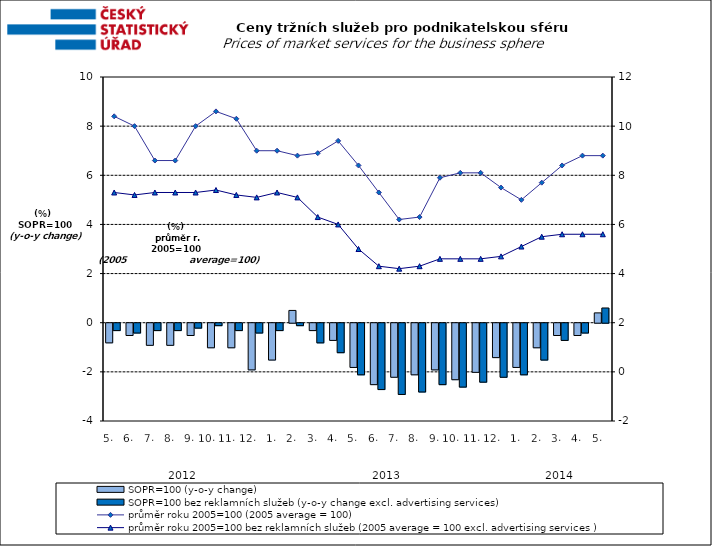
| Category | SOPR=100 (y-o-y change)   | SOPR=100 bez reklamních služeb (y-o-y change excl. advertising services)   |
|---|---|---|
| 0 | -0.8 | -0.3 |
| 1 | -0.5 | -0.4 |
| 2 | -0.9 | -0.3 |
| 3 | -0.9 | -0.3 |
| 4 | -0.5 | -0.2 |
| 5 | -1 | -0.1 |
| 6 | -1 | -0.3 |
| 7 | -1.9 | -0.4 |
| 8 | -1.5 | -0.3 |
| 9 | 0.5 | -0.1 |
| 10 | -0.3 | -0.8 |
| 11 | -0.7 | -1.2 |
| 12 | -1.8 | -2.1 |
| 13 | -2.5 | -2.7 |
| 14 | -2.2 | -2.9 |
| 15 | -2.1 | -2.8 |
| 16 | -1.9 | -2.5 |
| 17 | -2.3 | -2.6 |
| 18 | -2 | -2.4 |
| 19 | -1.4 | -2.2 |
| 20 | -1.8 | -2.1 |
| 21 | -1 | -1.5 |
| 22 | -0.5 | -0.7 |
| 23 | -0.5 | -0.4 |
| 24 | 0.4 | 0.6 |